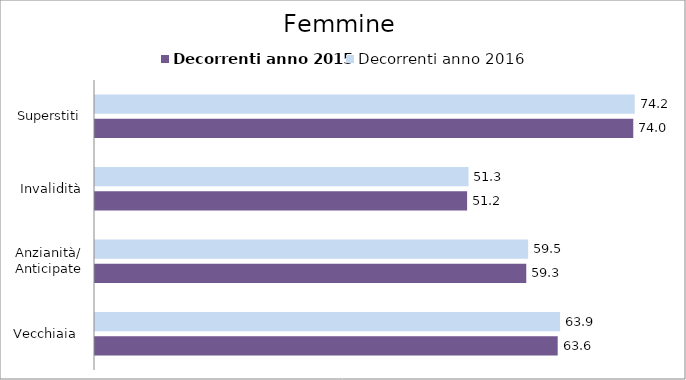
| Category | Decorrenti anno 2015 | Decorrenti anno 2016 |
|---|---|---|
| Vecchiaia  | 63.6 | 63.93 |
| Anzianità/ Anticipate | 59.28 | 59.54 |
| Invalidità | 51.15 | 51.34 |
| Superstiti | 73.99 | 74.19 |